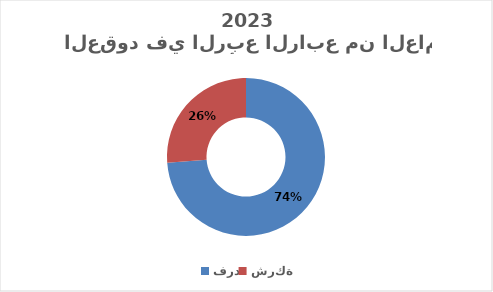
| Category | Series 0 |
|---|---|
| فرد | 0.738 |
| شركة | 0.262 |